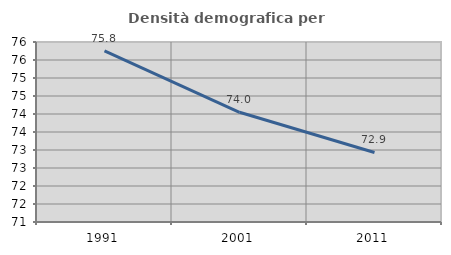
| Category | Densità demografica |
|---|---|
| 1991.0 | 75.755 |
| 2001.0 | 74.048 |
| 2011.0 | 72.932 |